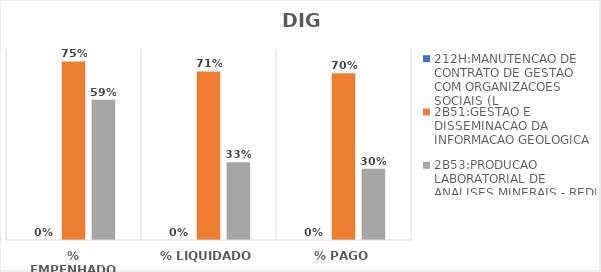
| Category | 212H:MANUTENCAO DE CONTRATO DE GESTAO COM ORGANIZACOES SOCIAIS (L | 2B51:GESTAO E DISSEMINACAO DA INFORMACAO GEOLOGICA | 2B53:PRODUCAO LABORATORIAL DE ANALISES MINERAIS - REDE LAMIN |
|---|---|---|---|
| % EMPENHADO | 0 | 0.748 | 0.587 |
| % LIQUIDADO | 0 | 0.706 | 0.325 |
| % PAGO | 0 | 0.699 | 0.298 |